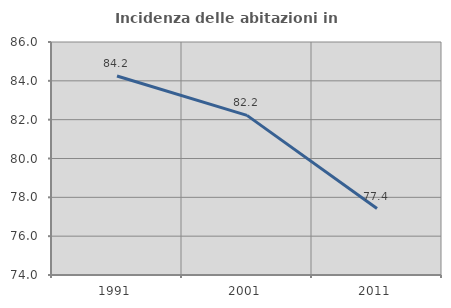
| Category | Incidenza delle abitazioni in proprietà  |
|---|---|
| 1991.0 | 84.248 |
| 2001.0 | 82.222 |
| 2011.0 | 77.423 |